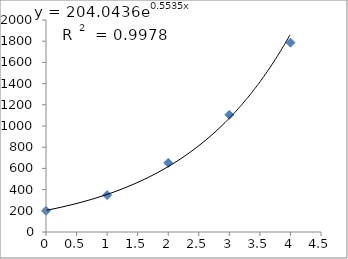
| Category | Series 0 |
|---|---|
| 0.0 | 200 |
| 1.0 | 348 |
| 2.0 | 652 |
| 3.0 | 1106 |
| 4.0 | 1786 |